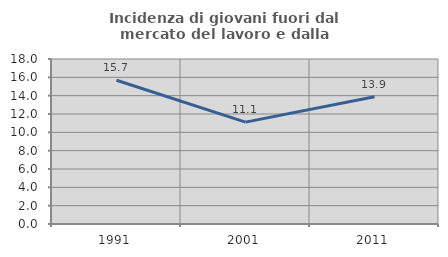
| Category | Incidenza di giovani fuori dal mercato del lavoro e dalla formazione  |
|---|---|
| 1991.0 | 15.686 |
| 2001.0 | 11.111 |
| 2011.0 | 13.889 |